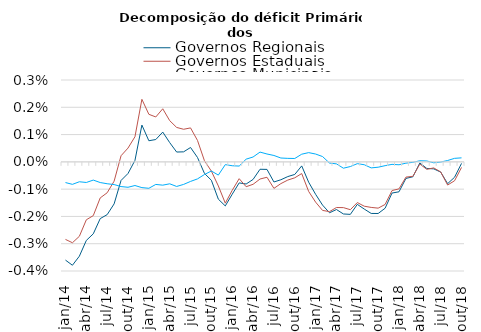
| Category | Governos Regionais | Governos Estaduais  | Governos Municipais |
|---|---|---|---|
| jan/14 | -0.004 | -0.003 | -0.001 |
| fev/14 | -0.004 | -0.003 | -0.001 |
| mar/14 | -0.003 | -0.003 | -0.001 |
| abr/14 | -0.003 | -0.002 | -0.001 |
| mai/14 | -0.003 | -0.002 | -0.001 |
| jun/14 | -0.002 | -0.001 | -0.001 |
| jul/14 | -0.002 | -0.001 | -0.001 |
| ago/14 | -0.002 | -0.001 | -0.001 |
| set/14 | -0.001 | 0 | -0.001 |
| out/14 | 0 | 0.001 | -0.001 |
| nov/14 | 0 | 0.001 | -0.001 |
| dez/14 | 0.001 | 0.002 | -0.001 |
| jan/15 | 0.001 | 0.002 | -0.001 |
| fev/15 | 0.001 | 0.002 | -0.001 |
| mar/15 | 0.001 | 0.002 | -0.001 |
| abr/15 | 0.001 | 0.002 | -0.001 |
| mai/15 | 0 | 0.001 | -0.001 |
| jun/15 | 0 | 0.001 | -0.001 |
| jul/15 | 0.001 | 0.001 | -0.001 |
| ago/15 | 0 | 0.001 | -0.001 |
| set/15 | 0 | 0 | 0 |
| out/15 | -0.001 | 0 | 0 |
| nov/15 | -0.001 | -0.001 | 0 |
| dez/15 | -0.002 | -0.002 | 0 |
| jan/16 | -0.001 | -0.001 | 0 |
| fev/16 | -0.001 | -0.001 | 0 |
| mar/16 | -0.001 | -0.001 | 0 |
| abr/16 | -0.001 | -0.001 | 0 |
| mai/16 | 0 | -0.001 | 0 |
| jun/16 | 0 | -0.001 | 0 |
| jul/16 | -0.001 | -0.001 | 0 |
| ago/16 | -0.001 | -0.001 | 0 |
| set/16 | -0.001 | -0.001 | 0 |
| out/16 | 0 | -0.001 | 0 |
| nov/16 | 0 | 0 | 0 |
| dez/16 | -0.001 | -0.001 | 0 |
| jan/17 | -0.001 | -0.001 | 0 |
| fev/17 | -0.002 | -0.002 | 0 |
| mar/17 | -0.002 | -0.002 | 0 |
| abr/17 | -0.002 | -0.002 | 0 |
| mai/17 | -0.002 | -0.002 | 0 |
| jun/17 | -0.002 | -0.002 | 0 |
| jul/17 | -0.002 | -0.001 | 0 |
| ago/17 | -0.002 | -0.002 | 0 |
| set/17 | -0.002 | -0.002 | 0 |
| out/17 | -0.002 | -0.002 | 0 |
| nov/17 | -0.002 | -0.002 | 0 |
| dez/17 | -0.001 | -0.001 | 0 |
| jan/18 | -0.001 | -0.001 | 0 |
| fev/18 | -0.001 | -0.001 | 0 |
| mar/18 | -0.001 | -0.001 | 0 |
| abr/18 | 0 | 0 | 0 |
| mai/18 | 0 | 0 | 0 |
| jun/18 | 0 | 0 | 0 |
| jul/18 | 0 | 0 | 0 |
| ago/18 | -0.001 | -0.001 | 0 |
| set/18 | -0.001 | -0.001 | 0 |
| out/18 | 0 | 0 | 0 |